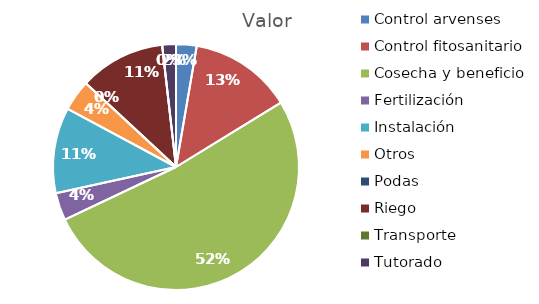
| Category | Valor |
|---|---|
| Control arvenses | 300000 |
| Control fitosanitario | 1500000 |
| Cosecha y beneficio | 5728000 |
| Fertilización | 400000 |
| Instalación | 1250000 |
| Otros | 450000 |
| Podas | 0 |
| Riego | 1250000 |
| Transporte | 0 |
| Tutorado | 200000 |